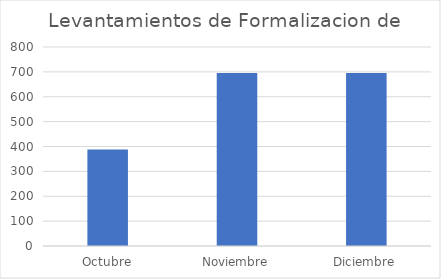
| Category | Levantamientos de Formalizacion de Contrato |
|---|---|
| Octubre | 388 |
| Noviembre | 695 |
| Diciembre | 695 |